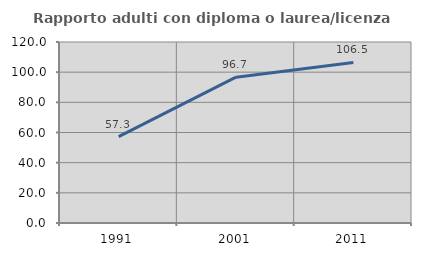
| Category | Rapporto adulti con diploma o laurea/licenza media  |
|---|---|
| 1991.0 | 57.273 |
| 2001.0 | 96.701 |
| 2011.0 | 106.462 |